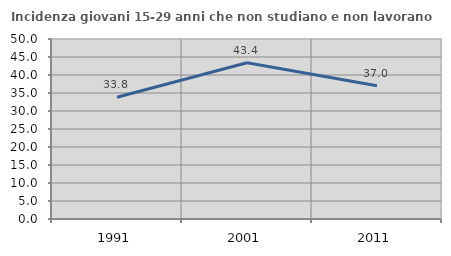
| Category | Incidenza giovani 15-29 anni che non studiano e non lavorano  |
|---|---|
| 1991.0 | 33.827 |
| 2001.0 | 43.419 |
| 2011.0 | 37.037 |